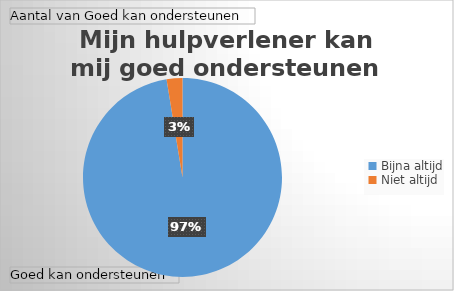
| Category | Totaal |
|---|---|
| Bijna altijd | 114 |
| Niet altijd | 3 |